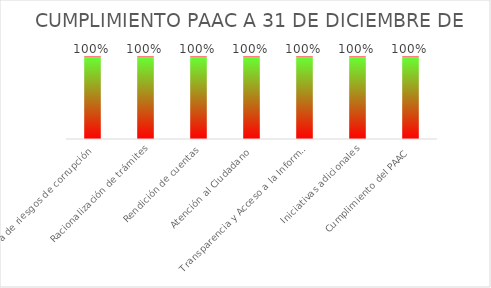
| Category | Series 0 |
|---|---|
| Mapa de riesgos de corrupción | 1 |
| Racionalización de trámites | 1 |
| Rendición de cuentas | 1 |
| Atención al Ciudadano | 1 |
| Transparencia y Acceso a la Información | 1 |
| Iniciativas adicionales | 1 |
| Cumplimiento del PAAC | 1 |